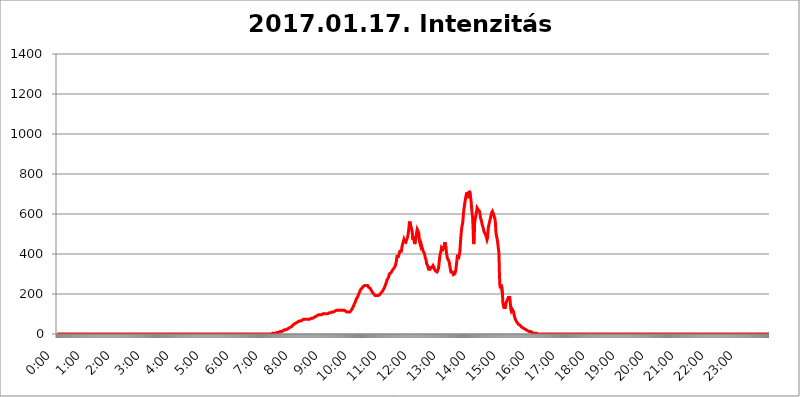
| Category | 2017.01.17. Intenzitás [W/m^2] |
|---|---|
| 0.0 | 0 |
| 0.0006944444444444445 | 0 |
| 0.001388888888888889 | 0 |
| 0.0020833333333333333 | 0 |
| 0.002777777777777778 | 0 |
| 0.003472222222222222 | 0 |
| 0.004166666666666667 | 0 |
| 0.004861111111111111 | 0 |
| 0.005555555555555556 | 0 |
| 0.0062499999999999995 | 0 |
| 0.006944444444444444 | 0 |
| 0.007638888888888889 | 0 |
| 0.008333333333333333 | 0 |
| 0.009027777777777779 | 0 |
| 0.009722222222222222 | 0 |
| 0.010416666666666666 | 0 |
| 0.011111111111111112 | 0 |
| 0.011805555555555555 | 0 |
| 0.012499999999999999 | 0 |
| 0.013194444444444444 | 0 |
| 0.013888888888888888 | 0 |
| 0.014583333333333332 | 0 |
| 0.015277777777777777 | 0 |
| 0.015972222222222224 | 0 |
| 0.016666666666666666 | 0 |
| 0.017361111111111112 | 0 |
| 0.018055555555555557 | 0 |
| 0.01875 | 0 |
| 0.019444444444444445 | 0 |
| 0.02013888888888889 | 0 |
| 0.020833333333333332 | 0 |
| 0.02152777777777778 | 0 |
| 0.022222222222222223 | 0 |
| 0.02291666666666667 | 0 |
| 0.02361111111111111 | 0 |
| 0.024305555555555556 | 0 |
| 0.024999999999999998 | 0 |
| 0.025694444444444447 | 0 |
| 0.02638888888888889 | 0 |
| 0.027083333333333334 | 0 |
| 0.027777777777777776 | 0 |
| 0.02847222222222222 | 0 |
| 0.029166666666666664 | 0 |
| 0.029861111111111113 | 0 |
| 0.030555555555555555 | 0 |
| 0.03125 | 0 |
| 0.03194444444444445 | 0 |
| 0.03263888888888889 | 0 |
| 0.03333333333333333 | 0 |
| 0.034027777777777775 | 0 |
| 0.034722222222222224 | 0 |
| 0.035416666666666666 | 0 |
| 0.036111111111111115 | 0 |
| 0.03680555555555556 | 0 |
| 0.0375 | 0 |
| 0.03819444444444444 | 0 |
| 0.03888888888888889 | 0 |
| 0.03958333333333333 | 0 |
| 0.04027777777777778 | 0 |
| 0.04097222222222222 | 0 |
| 0.041666666666666664 | 0 |
| 0.042361111111111106 | 0 |
| 0.04305555555555556 | 0 |
| 0.043750000000000004 | 0 |
| 0.044444444444444446 | 0 |
| 0.04513888888888889 | 0 |
| 0.04583333333333334 | 0 |
| 0.04652777777777778 | 0 |
| 0.04722222222222222 | 0 |
| 0.04791666666666666 | 0 |
| 0.04861111111111111 | 0 |
| 0.049305555555555554 | 0 |
| 0.049999999999999996 | 0 |
| 0.05069444444444445 | 0 |
| 0.051388888888888894 | 0 |
| 0.052083333333333336 | 0 |
| 0.05277777777777778 | 0 |
| 0.05347222222222222 | 0 |
| 0.05416666666666667 | 0 |
| 0.05486111111111111 | 0 |
| 0.05555555555555555 | 0 |
| 0.05625 | 0 |
| 0.05694444444444444 | 0 |
| 0.057638888888888885 | 0 |
| 0.05833333333333333 | 0 |
| 0.05902777777777778 | 0 |
| 0.059722222222222225 | 0 |
| 0.06041666666666667 | 0 |
| 0.061111111111111116 | 0 |
| 0.06180555555555556 | 0 |
| 0.0625 | 0 |
| 0.06319444444444444 | 0 |
| 0.06388888888888888 | 0 |
| 0.06458333333333334 | 0 |
| 0.06527777777777778 | 0 |
| 0.06597222222222222 | 0 |
| 0.06666666666666667 | 0 |
| 0.06736111111111111 | 0 |
| 0.06805555555555555 | 0 |
| 0.06874999999999999 | 0 |
| 0.06944444444444443 | 0 |
| 0.07013888888888889 | 0 |
| 0.07083333333333333 | 0 |
| 0.07152777777777779 | 0 |
| 0.07222222222222223 | 0 |
| 0.07291666666666667 | 0 |
| 0.07361111111111111 | 0 |
| 0.07430555555555556 | 0 |
| 0.075 | 0 |
| 0.07569444444444444 | 0 |
| 0.0763888888888889 | 0 |
| 0.07708333333333334 | 0 |
| 0.07777777777777778 | 0 |
| 0.07847222222222222 | 0 |
| 0.07916666666666666 | 0 |
| 0.0798611111111111 | 0 |
| 0.08055555555555556 | 0 |
| 0.08125 | 0 |
| 0.08194444444444444 | 0 |
| 0.08263888888888889 | 0 |
| 0.08333333333333333 | 0 |
| 0.08402777777777777 | 0 |
| 0.08472222222222221 | 0 |
| 0.08541666666666665 | 0 |
| 0.08611111111111112 | 0 |
| 0.08680555555555557 | 0 |
| 0.08750000000000001 | 0 |
| 0.08819444444444445 | 0 |
| 0.08888888888888889 | 0 |
| 0.08958333333333333 | 0 |
| 0.09027777777777778 | 0 |
| 0.09097222222222222 | 0 |
| 0.09166666666666667 | 0 |
| 0.09236111111111112 | 0 |
| 0.09305555555555556 | 0 |
| 0.09375 | 0 |
| 0.09444444444444444 | 0 |
| 0.09513888888888888 | 0 |
| 0.09583333333333333 | 0 |
| 0.09652777777777777 | 0 |
| 0.09722222222222222 | 0 |
| 0.09791666666666667 | 0 |
| 0.09861111111111111 | 0 |
| 0.09930555555555555 | 0 |
| 0.09999999999999999 | 0 |
| 0.10069444444444443 | 0 |
| 0.1013888888888889 | 0 |
| 0.10208333333333335 | 0 |
| 0.10277777777777779 | 0 |
| 0.10347222222222223 | 0 |
| 0.10416666666666667 | 0 |
| 0.10486111111111111 | 0 |
| 0.10555555555555556 | 0 |
| 0.10625 | 0 |
| 0.10694444444444444 | 0 |
| 0.1076388888888889 | 0 |
| 0.10833333333333334 | 0 |
| 0.10902777777777778 | 0 |
| 0.10972222222222222 | 0 |
| 0.1111111111111111 | 0 |
| 0.11180555555555556 | 0 |
| 0.11180555555555556 | 0 |
| 0.1125 | 0 |
| 0.11319444444444444 | 0 |
| 0.11388888888888889 | 0 |
| 0.11458333333333333 | 0 |
| 0.11527777777777777 | 0 |
| 0.11597222222222221 | 0 |
| 0.11666666666666665 | 0 |
| 0.1173611111111111 | 0 |
| 0.11805555555555557 | 0 |
| 0.11944444444444445 | 0 |
| 0.12013888888888889 | 0 |
| 0.12083333333333333 | 0 |
| 0.12152777777777778 | 0 |
| 0.12222222222222223 | 0 |
| 0.12291666666666667 | 0 |
| 0.12291666666666667 | 0 |
| 0.12361111111111112 | 0 |
| 0.12430555555555556 | 0 |
| 0.125 | 0 |
| 0.12569444444444444 | 0 |
| 0.12638888888888888 | 0 |
| 0.12708333333333333 | 0 |
| 0.16875 | 0 |
| 0.12847222222222224 | 0 |
| 0.12916666666666668 | 0 |
| 0.12986111111111112 | 0 |
| 0.13055555555555556 | 0 |
| 0.13125 | 0 |
| 0.13194444444444445 | 0 |
| 0.1326388888888889 | 0 |
| 0.13333333333333333 | 0 |
| 0.13402777777777777 | 0 |
| 0.13402777777777777 | 0 |
| 0.13472222222222222 | 0 |
| 0.13541666666666666 | 0 |
| 0.1361111111111111 | 0 |
| 0.13749999999999998 | 0 |
| 0.13819444444444443 | 0 |
| 0.1388888888888889 | 0 |
| 0.13958333333333334 | 0 |
| 0.14027777777777778 | 0 |
| 0.14097222222222222 | 0 |
| 0.14166666666666666 | 0 |
| 0.1423611111111111 | 0 |
| 0.14305555555555557 | 0 |
| 0.14375000000000002 | 0 |
| 0.14444444444444446 | 0 |
| 0.1451388888888889 | 0 |
| 0.1451388888888889 | 0 |
| 0.14652777777777778 | 0 |
| 0.14722222222222223 | 0 |
| 0.14791666666666667 | 0 |
| 0.1486111111111111 | 0 |
| 0.14930555555555555 | 0 |
| 0.15 | 0 |
| 0.15069444444444444 | 0 |
| 0.15138888888888888 | 0 |
| 0.15208333333333332 | 0 |
| 0.15277777777777776 | 0 |
| 0.15347222222222223 | 0 |
| 0.15416666666666667 | 0 |
| 0.15486111111111112 | 0 |
| 0.15555555555555556 | 0 |
| 0.15625 | 0 |
| 0.15694444444444444 | 0 |
| 0.15763888888888888 | 0 |
| 0.15833333333333333 | 0 |
| 0.15902777777777777 | 0 |
| 0.15972222222222224 | 0 |
| 0.16041666666666668 | 0 |
| 0.16111111111111112 | 0 |
| 0.16180555555555556 | 0 |
| 0.1625 | 0 |
| 0.16319444444444445 | 0 |
| 0.1638888888888889 | 0 |
| 0.16458333333333333 | 0 |
| 0.16527777777777777 | 0 |
| 0.16597222222222222 | 0 |
| 0.16666666666666666 | 0 |
| 0.1673611111111111 | 0 |
| 0.16805555555555554 | 0 |
| 0.16874999999999998 | 0 |
| 0.16944444444444443 | 0 |
| 0.17013888888888887 | 0 |
| 0.1708333333333333 | 0 |
| 0.17152777777777775 | 0 |
| 0.17222222222222225 | 0 |
| 0.1729166666666667 | 0 |
| 0.17361111111111113 | 0 |
| 0.17430555555555557 | 0 |
| 0.17500000000000002 | 0 |
| 0.17569444444444446 | 0 |
| 0.1763888888888889 | 0 |
| 0.17708333333333334 | 0 |
| 0.17777777777777778 | 0 |
| 0.17847222222222223 | 0 |
| 0.17916666666666667 | 0 |
| 0.1798611111111111 | 0 |
| 0.18055555555555555 | 0 |
| 0.18125 | 0 |
| 0.18194444444444444 | 0 |
| 0.1826388888888889 | 0 |
| 0.18333333333333335 | 0 |
| 0.1840277777777778 | 0 |
| 0.18472222222222223 | 0 |
| 0.18541666666666667 | 0 |
| 0.18611111111111112 | 0 |
| 0.18680555555555556 | 0 |
| 0.1875 | 0 |
| 0.18819444444444444 | 0 |
| 0.18888888888888888 | 0 |
| 0.18958333333333333 | 0 |
| 0.19027777777777777 | 0 |
| 0.1909722222222222 | 0 |
| 0.19166666666666665 | 0 |
| 0.19236111111111112 | 0 |
| 0.19305555555555554 | 0 |
| 0.19375 | 0 |
| 0.19444444444444445 | 0 |
| 0.1951388888888889 | 0 |
| 0.19583333333333333 | 0 |
| 0.19652777777777777 | 0 |
| 0.19722222222222222 | 0 |
| 0.19791666666666666 | 0 |
| 0.1986111111111111 | 0 |
| 0.19930555555555554 | 0 |
| 0.19999999999999998 | 0 |
| 0.20069444444444443 | 0 |
| 0.20138888888888887 | 0 |
| 0.2020833333333333 | 0 |
| 0.2027777777777778 | 0 |
| 0.2034722222222222 | 0 |
| 0.2041666666666667 | 0 |
| 0.20486111111111113 | 0 |
| 0.20555555555555557 | 0 |
| 0.20625000000000002 | 0 |
| 0.20694444444444446 | 0 |
| 0.2076388888888889 | 0 |
| 0.20833333333333334 | 0 |
| 0.20902777777777778 | 0 |
| 0.20972222222222223 | 0 |
| 0.21041666666666667 | 0 |
| 0.2111111111111111 | 0 |
| 0.21180555555555555 | 0 |
| 0.2125 | 0 |
| 0.21319444444444444 | 0 |
| 0.2138888888888889 | 0 |
| 0.21458333333333335 | 0 |
| 0.2152777777777778 | 0 |
| 0.21597222222222223 | 0 |
| 0.21666666666666667 | 0 |
| 0.21736111111111112 | 0 |
| 0.21805555555555556 | 0 |
| 0.21875 | 0 |
| 0.21944444444444444 | 0 |
| 0.22013888888888888 | 0 |
| 0.22083333333333333 | 0 |
| 0.22152777777777777 | 0 |
| 0.2222222222222222 | 0 |
| 0.22291666666666665 | 0 |
| 0.2236111111111111 | 0 |
| 0.22430555555555556 | 0 |
| 0.225 | 0 |
| 0.22569444444444445 | 0 |
| 0.2263888888888889 | 0 |
| 0.22708333333333333 | 0 |
| 0.22777777777777777 | 0 |
| 0.22847222222222222 | 0 |
| 0.22916666666666666 | 0 |
| 0.2298611111111111 | 0 |
| 0.23055555555555554 | 0 |
| 0.23124999999999998 | 0 |
| 0.23194444444444443 | 0 |
| 0.23263888888888887 | 0 |
| 0.2333333333333333 | 0 |
| 0.2340277777777778 | 0 |
| 0.2347222222222222 | 0 |
| 0.2354166666666667 | 0 |
| 0.23611111111111113 | 0 |
| 0.23680555555555557 | 0 |
| 0.23750000000000002 | 0 |
| 0.23819444444444446 | 0 |
| 0.2388888888888889 | 0 |
| 0.23958333333333334 | 0 |
| 0.24027777777777778 | 0 |
| 0.24097222222222223 | 0 |
| 0.24166666666666667 | 0 |
| 0.2423611111111111 | 0 |
| 0.24305555555555555 | 0 |
| 0.24375 | 0 |
| 0.24444444444444446 | 0 |
| 0.24513888888888888 | 0 |
| 0.24583333333333335 | 0 |
| 0.2465277777777778 | 0 |
| 0.24722222222222223 | 0 |
| 0.24791666666666667 | 0 |
| 0.24861111111111112 | 0 |
| 0.24930555555555556 | 0 |
| 0.25 | 0 |
| 0.25069444444444444 | 0 |
| 0.2513888888888889 | 0 |
| 0.2520833333333333 | 0 |
| 0.25277777777777777 | 0 |
| 0.2534722222222222 | 0 |
| 0.25416666666666665 | 0 |
| 0.2548611111111111 | 0 |
| 0.2555555555555556 | 0 |
| 0.25625000000000003 | 0 |
| 0.2569444444444445 | 0 |
| 0.2576388888888889 | 0 |
| 0.25833333333333336 | 0 |
| 0.2590277777777778 | 0 |
| 0.25972222222222224 | 0 |
| 0.2604166666666667 | 0 |
| 0.2611111111111111 | 0 |
| 0.26180555555555557 | 0 |
| 0.2625 | 0 |
| 0.26319444444444445 | 0 |
| 0.2638888888888889 | 0 |
| 0.26458333333333334 | 0 |
| 0.2652777777777778 | 0 |
| 0.2659722222222222 | 0 |
| 0.26666666666666666 | 0 |
| 0.2673611111111111 | 0 |
| 0.26805555555555555 | 0 |
| 0.26875 | 0 |
| 0.26944444444444443 | 0 |
| 0.2701388888888889 | 0 |
| 0.2708333333333333 | 0 |
| 0.27152777777777776 | 0 |
| 0.2722222222222222 | 0 |
| 0.27291666666666664 | 0 |
| 0.2736111111111111 | 0 |
| 0.2743055555555555 | 0 |
| 0.27499999999999997 | 0 |
| 0.27569444444444446 | 0 |
| 0.27638888888888885 | 0 |
| 0.27708333333333335 | 0 |
| 0.2777777777777778 | 0 |
| 0.27847222222222223 | 0 |
| 0.2791666666666667 | 0 |
| 0.2798611111111111 | 0 |
| 0.28055555555555556 | 0 |
| 0.28125 | 0 |
| 0.28194444444444444 | 0 |
| 0.2826388888888889 | 0 |
| 0.2833333333333333 | 0 |
| 0.28402777777777777 | 0 |
| 0.2847222222222222 | 0 |
| 0.28541666666666665 | 0 |
| 0.28611111111111115 | 0 |
| 0.28680555555555554 | 0 |
| 0.28750000000000003 | 0 |
| 0.2881944444444445 | 0 |
| 0.2888888888888889 | 0 |
| 0.28958333333333336 | 0 |
| 0.2902777777777778 | 0 |
| 0.29097222222222224 | 0 |
| 0.2916666666666667 | 0 |
| 0.2923611111111111 | 0 |
| 0.29305555555555557 | 0 |
| 0.29375 | 0 |
| 0.29444444444444445 | 0 |
| 0.2951388888888889 | 0 |
| 0.29583333333333334 | 0 |
| 0.2965277777777778 | 0 |
| 0.2972222222222222 | 0 |
| 0.29791666666666666 | 0 |
| 0.2986111111111111 | 0 |
| 0.29930555555555555 | 0 |
| 0.3 | 0 |
| 0.30069444444444443 | 3.525 |
| 0.3013888888888889 | 3.525 |
| 0.3020833333333333 | 3.525 |
| 0.30277777777777776 | 3.525 |
| 0.3034722222222222 | 3.525 |
| 0.30416666666666664 | 3.525 |
| 0.3048611111111111 | 3.525 |
| 0.3055555555555555 | 3.525 |
| 0.30624999999999997 | 3.525 |
| 0.3069444444444444 | 3.525 |
| 0.3076388888888889 | 7.887 |
| 0.30833333333333335 | 7.887 |
| 0.3090277777777778 | 7.887 |
| 0.30972222222222223 | 7.887 |
| 0.3104166666666667 | 7.887 |
| 0.3111111111111111 | 12.257 |
| 0.31180555555555556 | 12.257 |
| 0.3125 | 12.257 |
| 0.31319444444444444 | 12.257 |
| 0.3138888888888889 | 12.257 |
| 0.3145833333333333 | 12.257 |
| 0.31527777777777777 | 12.257 |
| 0.3159722222222222 | 12.257 |
| 0.31666666666666665 | 16.636 |
| 0.31736111111111115 | 16.636 |
| 0.31805555555555554 | 16.636 |
| 0.31875000000000003 | 21.024 |
| 0.3194444444444445 | 21.024 |
| 0.3201388888888889 | 21.024 |
| 0.32083333333333336 | 21.024 |
| 0.3215277777777778 | 25.419 |
| 0.32222222222222224 | 25.419 |
| 0.3229166666666667 | 25.419 |
| 0.3236111111111111 | 25.419 |
| 0.32430555555555557 | 29.823 |
| 0.325 | 29.823 |
| 0.32569444444444445 | 29.823 |
| 0.3263888888888889 | 34.234 |
| 0.32708333333333334 | 34.234 |
| 0.3277777777777778 | 34.234 |
| 0.3284722222222222 | 38.653 |
| 0.32916666666666666 | 38.653 |
| 0.3298611111111111 | 38.653 |
| 0.33055555555555555 | 43.079 |
| 0.33125 | 47.511 |
| 0.33194444444444443 | 47.511 |
| 0.3326388888888889 | 47.511 |
| 0.3333333333333333 | 51.951 |
| 0.3340277777777778 | 51.951 |
| 0.3347222222222222 | 56.398 |
| 0.3354166666666667 | 56.398 |
| 0.3361111111111111 | 60.85 |
| 0.3368055555555556 | 60.85 |
| 0.33749999999999997 | 60.85 |
| 0.33819444444444446 | 60.85 |
| 0.33888888888888885 | 60.85 |
| 0.33958333333333335 | 65.31 |
| 0.34027777777777773 | 65.31 |
| 0.34097222222222223 | 65.31 |
| 0.3416666666666666 | 65.31 |
| 0.3423611111111111 | 65.31 |
| 0.3430555555555555 | 69.775 |
| 0.34375 | 69.775 |
| 0.3444444444444445 | 69.775 |
| 0.3451388888888889 | 74.246 |
| 0.3458333333333334 | 74.246 |
| 0.34652777777777777 | 74.246 |
| 0.34722222222222227 | 74.246 |
| 0.34791666666666665 | 74.246 |
| 0.34861111111111115 | 74.246 |
| 0.34930555555555554 | 74.246 |
| 0.35000000000000003 | 74.246 |
| 0.3506944444444444 | 74.246 |
| 0.3513888888888889 | 74.246 |
| 0.3520833333333333 | 74.246 |
| 0.3527777777777778 | 74.246 |
| 0.3534722222222222 | 74.246 |
| 0.3541666666666667 | 74.246 |
| 0.3548611111111111 | 74.246 |
| 0.35555555555555557 | 74.246 |
| 0.35625 | 78.722 |
| 0.35694444444444445 | 78.722 |
| 0.3576388888888889 | 78.722 |
| 0.35833333333333334 | 78.722 |
| 0.3590277777777778 | 83.205 |
| 0.3597222222222222 | 83.205 |
| 0.36041666666666666 | 83.205 |
| 0.3611111111111111 | 83.205 |
| 0.36180555555555555 | 87.692 |
| 0.3625 | 87.692 |
| 0.36319444444444443 | 87.692 |
| 0.3638888888888889 | 92.184 |
| 0.3645833333333333 | 92.184 |
| 0.3652777777777778 | 92.184 |
| 0.3659722222222222 | 92.184 |
| 0.3666666666666667 | 96.682 |
| 0.3673611111111111 | 96.682 |
| 0.3680555555555556 | 96.682 |
| 0.36874999999999997 | 96.682 |
| 0.36944444444444446 | 96.682 |
| 0.37013888888888885 | 96.682 |
| 0.37083333333333335 | 96.682 |
| 0.37152777777777773 | 101.184 |
| 0.37222222222222223 | 101.184 |
| 0.3729166666666666 | 101.184 |
| 0.3736111111111111 | 101.184 |
| 0.3743055555555555 | 101.184 |
| 0.375 | 101.184 |
| 0.3756944444444445 | 101.184 |
| 0.3763888888888889 | 101.184 |
| 0.3770833333333334 | 101.184 |
| 0.37777777777777777 | 101.184 |
| 0.37847222222222227 | 101.184 |
| 0.37916666666666665 | 101.184 |
| 0.37986111111111115 | 105.69 |
| 0.38055555555555554 | 105.69 |
| 0.38125000000000003 | 105.69 |
| 0.3819444444444444 | 105.69 |
| 0.3826388888888889 | 105.69 |
| 0.3833333333333333 | 105.69 |
| 0.3840277777777778 | 105.69 |
| 0.3847222222222222 | 110.201 |
| 0.3854166666666667 | 110.201 |
| 0.3861111111111111 | 110.201 |
| 0.38680555555555557 | 110.201 |
| 0.3875 | 110.201 |
| 0.38819444444444445 | 114.716 |
| 0.3888888888888889 | 114.716 |
| 0.38958333333333334 | 114.716 |
| 0.3902777777777778 | 114.716 |
| 0.3909722222222222 | 119.235 |
| 0.39166666666666666 | 119.235 |
| 0.3923611111111111 | 119.235 |
| 0.39305555555555555 | 119.235 |
| 0.39375 | 119.235 |
| 0.39444444444444443 | 119.235 |
| 0.3951388888888889 | 119.235 |
| 0.3958333333333333 | 119.235 |
| 0.3965277777777778 | 119.235 |
| 0.3972222222222222 | 119.235 |
| 0.3979166666666667 | 119.235 |
| 0.3986111111111111 | 119.235 |
| 0.3993055555555556 | 119.235 |
| 0.39999999999999997 | 119.235 |
| 0.40069444444444446 | 119.235 |
| 0.40138888888888885 | 119.235 |
| 0.40208333333333335 | 119.235 |
| 0.40277777777777773 | 119.235 |
| 0.40347222222222223 | 114.716 |
| 0.4041666666666666 | 114.716 |
| 0.4048611111111111 | 114.716 |
| 0.4055555555555555 | 114.716 |
| 0.40625 | 110.201 |
| 0.4069444444444445 | 110.201 |
| 0.4076388888888889 | 110.201 |
| 0.4083333333333334 | 110.201 |
| 0.40902777777777777 | 110.201 |
| 0.40972222222222227 | 110.201 |
| 0.41041666666666665 | 110.201 |
| 0.41111111111111115 | 114.716 |
| 0.41180555555555554 | 114.716 |
| 0.41250000000000003 | 119.235 |
| 0.4131944444444444 | 123.758 |
| 0.4138888888888889 | 128.284 |
| 0.4145833333333333 | 132.814 |
| 0.4152777777777778 | 137.347 |
| 0.4159722222222222 | 141.884 |
| 0.4166666666666667 | 150.964 |
| 0.4173611111111111 | 155.509 |
| 0.41805555555555557 | 160.056 |
| 0.41875 | 169.156 |
| 0.41944444444444445 | 173.709 |
| 0.4201388888888889 | 178.264 |
| 0.42083333333333334 | 182.82 |
| 0.4215277777777778 | 187.378 |
| 0.4222222222222222 | 191.937 |
| 0.42291666666666666 | 201.058 |
| 0.4236111111111111 | 205.62 |
| 0.42430555555555555 | 210.182 |
| 0.425 | 219.309 |
| 0.42569444444444443 | 219.309 |
| 0.4263888888888889 | 223.873 |
| 0.4270833333333333 | 228.436 |
| 0.4277777777777778 | 233 |
| 0.4284722222222222 | 233 |
| 0.4291666666666667 | 237.564 |
| 0.4298611111111111 | 237.564 |
| 0.4305555555555556 | 242.127 |
| 0.43124999999999997 | 242.127 |
| 0.43194444444444446 | 242.127 |
| 0.43263888888888885 | 242.127 |
| 0.43333333333333335 | 242.127 |
| 0.43402777777777773 | 242.127 |
| 0.43472222222222223 | 242.127 |
| 0.4354166666666666 | 242.127 |
| 0.4361111111111111 | 237.564 |
| 0.4368055555555555 | 233 |
| 0.4375 | 233 |
| 0.4381944444444445 | 228.436 |
| 0.4388888888888889 | 228.436 |
| 0.4395833333333334 | 223.873 |
| 0.44027777777777777 | 219.309 |
| 0.44097222222222227 | 214.746 |
| 0.44166666666666665 | 210.182 |
| 0.44236111111111115 | 210.182 |
| 0.44305555555555554 | 205.62 |
| 0.44375000000000003 | 201.058 |
| 0.4444444444444444 | 196.497 |
| 0.4451388888888889 | 196.497 |
| 0.4458333333333333 | 191.937 |
| 0.4465277777777778 | 191.937 |
| 0.4472222222222222 | 191.937 |
| 0.4479166666666667 | 191.937 |
| 0.4486111111111111 | 191.937 |
| 0.44930555555555557 | 191.937 |
| 0.45 | 191.937 |
| 0.45069444444444445 | 191.937 |
| 0.4513888888888889 | 191.937 |
| 0.45208333333333334 | 196.497 |
| 0.4527777777777778 | 196.497 |
| 0.4534722222222222 | 201.058 |
| 0.45416666666666666 | 205.62 |
| 0.4548611111111111 | 210.182 |
| 0.45555555555555555 | 210.182 |
| 0.45625 | 214.746 |
| 0.45694444444444443 | 219.309 |
| 0.4576388888888889 | 223.873 |
| 0.4583333333333333 | 228.436 |
| 0.4590277777777778 | 233 |
| 0.4597222222222222 | 237.564 |
| 0.4604166666666667 | 246.689 |
| 0.4611111111111111 | 251.251 |
| 0.4618055555555556 | 260.373 |
| 0.46249999999999997 | 269.49 |
| 0.46319444444444446 | 269.49 |
| 0.46388888888888885 | 274.047 |
| 0.46458333333333335 | 283.156 |
| 0.46527777777777773 | 292.259 |
| 0.46597222222222223 | 301.354 |
| 0.4666666666666666 | 305.898 |
| 0.4673611111111111 | 301.354 |
| 0.4680555555555555 | 305.898 |
| 0.46875 | 310.44 |
| 0.4694444444444445 | 310.44 |
| 0.4701388888888889 | 319.517 |
| 0.4708333333333334 | 324.052 |
| 0.47152777777777777 | 324.052 |
| 0.47222222222222227 | 328.584 |
| 0.47291666666666665 | 328.584 |
| 0.47361111111111115 | 328.584 |
| 0.47430555555555554 | 342.162 |
| 0.47500000000000003 | 355.712 |
| 0.4756944444444444 | 364.728 |
| 0.4763888888888889 | 387.202 |
| 0.4770833333333333 | 387.202 |
| 0.4777777777777778 | 387.202 |
| 0.4784722222222222 | 387.202 |
| 0.4791666666666667 | 396.164 |
| 0.4798611111111111 | 400.638 |
| 0.48055555555555557 | 414.035 |
| 0.48125 | 414.035 |
| 0.48194444444444445 | 409.574 |
| 0.4826388888888889 | 414.035 |
| 0.48333333333333334 | 431.833 |
| 0.4840277777777778 | 445.129 |
| 0.4847222222222222 | 449.551 |
| 0.48541666666666666 | 462.786 |
| 0.4861111111111111 | 471.582 |
| 0.48680555555555555 | 462.786 |
| 0.4875 | 467.187 |
| 0.48819444444444443 | 458.38 |
| 0.4888888888888889 | 458.38 |
| 0.4895833333333333 | 467.187 |
| 0.4902777777777778 | 467.187 |
| 0.4909722222222222 | 467.187 |
| 0.4916666666666667 | 489.108 |
| 0.4923611111111111 | 506.542 |
| 0.4930555555555556 | 523.88 |
| 0.49374999999999997 | 553.986 |
| 0.49444444444444446 | 562.53 |
| 0.49513888888888885 | 562.53 |
| 0.49583333333333335 | 541.121 |
| 0.49652777777777773 | 536.82 |
| 0.49722222222222223 | 536.82 |
| 0.4979166666666666 | 510.885 |
| 0.4986111111111111 | 471.582 |
| 0.4993055555555555 | 475.972 |
| 0.5 | 489.108 |
| 0.5006944444444444 | 462.786 |
| 0.5013888888888889 | 449.551 |
| 0.5020833333333333 | 462.786 |
| 0.5027777777777778 | 471.582 |
| 0.5034722222222222 | 475.972 |
| 0.5041666666666667 | 510.885 |
| 0.5048611111111111 | 523.88 |
| 0.5055555555555555 | 519.555 |
| 0.50625 | 523.88 |
| 0.5069444444444444 | 506.542 |
| 0.5076388888888889 | 480.356 |
| 0.5083333333333333 | 458.38 |
| 0.5090277777777777 | 449.551 |
| 0.5097222222222222 | 440.702 |
| 0.5104166666666666 | 449.551 |
| 0.5111111111111112 | 440.702 |
| 0.5118055555555555 | 431.833 |
| 0.5125000000000001 | 422.943 |
| 0.5131944444444444 | 414.035 |
| 0.513888888888889 | 414.035 |
| 0.5145833333333333 | 414.035 |
| 0.5152777777777778 | 400.638 |
| 0.5159722222222222 | 382.715 |
| 0.5166666666666667 | 378.224 |
| 0.517361111111111 | 369.23 |
| 0.5180555555555556 | 351.198 |
| 0.5187499999999999 | 346.682 |
| 0.5194444444444445 | 342.162 |
| 0.5201388888888888 | 333.113 |
| 0.5208333333333334 | 324.052 |
| 0.5215277777777778 | 319.517 |
| 0.5222222222222223 | 319.517 |
| 0.5229166666666667 | 324.052 |
| 0.5236111111111111 | 333.113 |
| 0.5243055555555556 | 337.639 |
| 0.525 | 337.639 |
| 0.5256944444444445 | 333.113 |
| 0.5263888888888889 | 337.639 |
| 0.5270833333333333 | 342.162 |
| 0.5277777777777778 | 342.162 |
| 0.5284722222222222 | 333.113 |
| 0.5291666666666667 | 324.052 |
| 0.5298611111111111 | 324.052 |
| 0.5305555555555556 | 314.98 |
| 0.53125 | 310.44 |
| 0.5319444444444444 | 310.44 |
| 0.5326388888888889 | 310.44 |
| 0.5333333333333333 | 310.44 |
| 0.5340277777777778 | 314.98 |
| 0.5347222222222222 | 328.584 |
| 0.5354166666666667 | 351.198 |
| 0.5361111111111111 | 373.729 |
| 0.5368055555555555 | 396.164 |
| 0.5375 | 405.108 |
| 0.5381944444444444 | 414.035 |
| 0.5388888888888889 | 431.833 |
| 0.5395833333333333 | 431.833 |
| 0.5402777777777777 | 427.39 |
| 0.5409722222222222 | 422.943 |
| 0.5416666666666666 | 422.943 |
| 0.5423611111111112 | 431.833 |
| 0.5430555555555555 | 449.551 |
| 0.5437500000000001 | 458.38 |
| 0.5444444444444444 | 453.968 |
| 0.545138888888889 | 431.833 |
| 0.5458333333333333 | 409.574 |
| 0.5465277777777778 | 391.685 |
| 0.5472222222222222 | 378.224 |
| 0.5479166666666667 | 373.729 |
| 0.548611111111111 | 369.23 |
| 0.5493055555555556 | 364.728 |
| 0.5499999999999999 | 355.712 |
| 0.5506944444444445 | 337.639 |
| 0.5513888888888888 | 324.052 |
| 0.5520833333333334 | 310.44 |
| 0.5527777777777778 | 305.898 |
| 0.5534722222222223 | 305.898 |
| 0.5541666666666667 | 310.44 |
| 0.5548611111111111 | 305.898 |
| 0.5555555555555556 | 296.808 |
| 0.55625 | 296.808 |
| 0.5569444444444445 | 296.808 |
| 0.5576388888888889 | 301.354 |
| 0.5583333333333333 | 305.898 |
| 0.5590277777777778 | 319.517 |
| 0.5597222222222222 | 342.162 |
| 0.5604166666666667 | 364.728 |
| 0.5611111111111111 | 387.202 |
| 0.5618055555555556 | 387.202 |
| 0.5625 | 382.715 |
| 0.5631944444444444 | 382.715 |
| 0.5638888888888889 | 387.202 |
| 0.5645833333333333 | 409.574 |
| 0.5652777777777778 | 445.129 |
| 0.5659722222222222 | 480.356 |
| 0.5666666666666667 | 510.885 |
| 0.5673611111111111 | 532.513 |
| 0.5680555555555555 | 545.416 |
| 0.56875 | 558.261 |
| 0.5694444444444444 | 592.233 |
| 0.5701388888888889 | 617.436 |
| 0.5708333333333333 | 634.105 |
| 0.5715277777777777 | 654.791 |
| 0.5722222222222222 | 667.123 |
| 0.5729166666666666 | 683.473 |
| 0.5736111111111112 | 695.666 |
| 0.5743055555555555 | 707.8 |
| 0.5750000000000001 | 695.666 |
| 0.5756944444444444 | 679.395 |
| 0.576388888888889 | 679.395 |
| 0.5770833333333333 | 695.666 |
| 0.5777777777777778 | 715.858 |
| 0.5784722222222222 | 715.858 |
| 0.5791666666666667 | 703.762 |
| 0.579861111111111 | 679.395 |
| 0.5805555555555556 | 658.909 |
| 0.5812499999999999 | 625.784 |
| 0.5819444444444445 | 600.661 |
| 0.5826388888888888 | 579.542 |
| 0.5833333333333334 | 515.223 |
| 0.5840277777777778 | 449.551 |
| 0.5847222222222223 | 471.582 |
| 0.5854166666666667 | 558.261 |
| 0.5861111111111111 | 575.299 |
| 0.5868055555555556 | 583.779 |
| 0.5875 | 600.661 |
| 0.5881944444444445 | 613.252 |
| 0.5888888888888889 | 629.948 |
| 0.5895833333333333 | 629.948 |
| 0.5902777777777778 | 621.613 |
| 0.5909722222222222 | 617.436 |
| 0.5916666666666667 | 625.784 |
| 0.5923611111111111 | 613.252 |
| 0.5930555555555556 | 596.45 |
| 0.59375 | 579.542 |
| 0.5944444444444444 | 575.299 |
| 0.5951388888888889 | 562.53 |
| 0.5958333333333333 | 549.704 |
| 0.5965277777777778 | 549.704 |
| 0.5972222222222222 | 532.513 |
| 0.5979166666666667 | 523.88 |
| 0.5986111111111111 | 510.885 |
| 0.5993055555555555 | 506.542 |
| 0.6 | 502.192 |
| 0.6006944444444444 | 497.836 |
| 0.6013888888888889 | 489.108 |
| 0.6020833333333333 | 480.356 |
| 0.6027777777777777 | 471.582 |
| 0.6034722222222222 | 480.356 |
| 0.6041666666666666 | 510.885 |
| 0.6048611111111112 | 536.82 |
| 0.6055555555555555 | 549.704 |
| 0.6062500000000001 | 558.261 |
| 0.6069444444444444 | 571.049 |
| 0.607638888888889 | 579.542 |
| 0.6083333333333333 | 592.233 |
| 0.6090277777777778 | 604.864 |
| 0.6097222222222222 | 609.062 |
| 0.6104166666666667 | 613.252 |
| 0.611111111111111 | 609.062 |
| 0.6118055555555556 | 600.661 |
| 0.6124999999999999 | 592.233 |
| 0.6131944444444445 | 583.779 |
| 0.6138888888888888 | 575.299 |
| 0.6145833333333334 | 553.986 |
| 0.6152777777777778 | 506.542 |
| 0.6159722222222223 | 493.475 |
| 0.6166666666666667 | 480.356 |
| 0.6173611111111111 | 467.187 |
| 0.6180555555555556 | 467.187 |
| 0.61875 | 462.786 |
| 0.6194444444444445 | 405.108 |
| 0.6201388888888889 | 301.354 |
| 0.6208333333333333 | 242.127 |
| 0.6215277777777778 | 228.436 |
| 0.6222222222222222 | 228.436 |
| 0.6229166666666667 | 246.689 |
| 0.6236111111111111 | 246.689 |
| 0.6243055555555556 | 205.62 |
| 0.625 | 160.056 |
| 0.6256944444444444 | 141.884 |
| 0.6263888888888889 | 132.814 |
| 0.6270833333333333 | 128.284 |
| 0.6277777777777778 | 128.284 |
| 0.6284722222222222 | 132.814 |
| 0.6291666666666667 | 146.423 |
| 0.6298611111111111 | 160.056 |
| 0.6305555555555555 | 164.605 |
| 0.63125 | 169.156 |
| 0.6319444444444444 | 173.709 |
| 0.6326388888888889 | 182.82 |
| 0.6333333333333333 | 187.378 |
| 0.6340277777777777 | 187.378 |
| 0.6347222222222222 | 182.82 |
| 0.6354166666666666 | 155.509 |
| 0.6361111111111112 | 123.758 |
| 0.6368055555555555 | 114.716 |
| 0.6375000000000001 | 119.235 |
| 0.6381944444444444 | 123.758 |
| 0.638888888888889 | 123.758 |
| 0.6395833333333333 | 114.716 |
| 0.6402777777777778 | 105.69 |
| 0.6409722222222222 | 92.184 |
| 0.6416666666666667 | 83.205 |
| 0.642361111111111 | 74.246 |
| 0.6430555555555556 | 69.775 |
| 0.6437499999999999 | 65.31 |
| 0.6444444444444445 | 60.85 |
| 0.6451388888888888 | 56.398 |
| 0.6458333333333334 | 56.398 |
| 0.6465277777777778 | 51.951 |
| 0.6472222222222223 | 47.511 |
| 0.6479166666666667 | 47.511 |
| 0.6486111111111111 | 43.079 |
| 0.6493055555555556 | 43.079 |
| 0.65 | 38.653 |
| 0.6506944444444445 | 38.653 |
| 0.6513888888888889 | 34.234 |
| 0.6520833333333333 | 34.234 |
| 0.6527777777777778 | 29.823 |
| 0.6534722222222222 | 29.823 |
| 0.6541666666666667 | 29.823 |
| 0.6548611111111111 | 25.419 |
| 0.6555555555555556 | 25.419 |
| 0.65625 | 25.419 |
| 0.6569444444444444 | 21.024 |
| 0.6576388888888889 | 21.024 |
| 0.6583333333333333 | 21.024 |
| 0.6590277777777778 | 21.024 |
| 0.6597222222222222 | 16.636 |
| 0.6604166666666667 | 16.636 |
| 0.6611111111111111 | 16.636 |
| 0.6618055555555555 | 12.257 |
| 0.6625 | 12.257 |
| 0.6631944444444444 | 12.257 |
| 0.6638888888888889 | 12.257 |
| 0.6645833333333333 | 12.257 |
| 0.6652777777777777 | 7.887 |
| 0.6659722222222222 | 7.887 |
| 0.6666666666666666 | 7.887 |
| 0.6673611111111111 | 3.525 |
| 0.6680555555555556 | 3.525 |
| 0.6687500000000001 | 3.525 |
| 0.6694444444444444 | 3.525 |
| 0.6701388888888888 | 3.525 |
| 0.6708333333333334 | 3.525 |
| 0.6715277777777778 | 3.525 |
| 0.6722222222222222 | 3.525 |
| 0.6729166666666666 | 3.525 |
| 0.6736111111111112 | 0 |
| 0.6743055555555556 | 0 |
| 0.6749999999999999 | 0 |
| 0.6756944444444444 | 0 |
| 0.6763888888888889 | 0 |
| 0.6770833333333334 | 0 |
| 0.6777777777777777 | 0 |
| 0.6784722222222223 | 0 |
| 0.6791666666666667 | 0 |
| 0.6798611111111111 | 0 |
| 0.6805555555555555 | 0 |
| 0.68125 | 0 |
| 0.6819444444444445 | 0 |
| 0.6826388888888889 | 0 |
| 0.6833333333333332 | 0 |
| 0.6840277777777778 | 0 |
| 0.6847222222222222 | 0 |
| 0.6854166666666667 | 0 |
| 0.686111111111111 | 0 |
| 0.6868055555555556 | 0 |
| 0.6875 | 0 |
| 0.6881944444444444 | 0 |
| 0.688888888888889 | 0 |
| 0.6895833333333333 | 0 |
| 0.6902777777777778 | 0 |
| 0.6909722222222222 | 0 |
| 0.6916666666666668 | 0 |
| 0.6923611111111111 | 0 |
| 0.6930555555555555 | 0 |
| 0.69375 | 0 |
| 0.6944444444444445 | 0 |
| 0.6951388888888889 | 0 |
| 0.6958333333333333 | 0 |
| 0.6965277777777777 | 0 |
| 0.6972222222222223 | 0 |
| 0.6979166666666666 | 0 |
| 0.6986111111111111 | 0 |
| 0.6993055555555556 | 0 |
| 0.7000000000000001 | 0 |
| 0.7006944444444444 | 0 |
| 0.7013888888888888 | 0 |
| 0.7020833333333334 | 0 |
| 0.7027777777777778 | 0 |
| 0.7034722222222222 | 0 |
| 0.7041666666666666 | 0 |
| 0.7048611111111112 | 0 |
| 0.7055555555555556 | 0 |
| 0.7062499999999999 | 0 |
| 0.7069444444444444 | 0 |
| 0.7076388888888889 | 0 |
| 0.7083333333333334 | 0 |
| 0.7090277777777777 | 0 |
| 0.7097222222222223 | 0 |
| 0.7104166666666667 | 0 |
| 0.7111111111111111 | 0 |
| 0.7118055555555555 | 0 |
| 0.7125 | 0 |
| 0.7131944444444445 | 0 |
| 0.7138888888888889 | 0 |
| 0.7145833333333332 | 0 |
| 0.7152777777777778 | 0 |
| 0.7159722222222222 | 0 |
| 0.7166666666666667 | 0 |
| 0.717361111111111 | 0 |
| 0.7180555555555556 | 0 |
| 0.71875 | 0 |
| 0.7194444444444444 | 0 |
| 0.720138888888889 | 0 |
| 0.7208333333333333 | 0 |
| 0.7215277777777778 | 0 |
| 0.7222222222222222 | 0 |
| 0.7229166666666668 | 0 |
| 0.7236111111111111 | 0 |
| 0.7243055555555555 | 0 |
| 0.725 | 0 |
| 0.7256944444444445 | 0 |
| 0.7263888888888889 | 0 |
| 0.7270833333333333 | 0 |
| 0.7277777777777777 | 0 |
| 0.7284722222222223 | 0 |
| 0.7291666666666666 | 0 |
| 0.7298611111111111 | 0 |
| 0.7305555555555556 | 0 |
| 0.7312500000000001 | 0 |
| 0.7319444444444444 | 0 |
| 0.7326388888888888 | 0 |
| 0.7333333333333334 | 0 |
| 0.7340277777777778 | 0 |
| 0.7347222222222222 | 0 |
| 0.7354166666666666 | 0 |
| 0.7361111111111112 | 0 |
| 0.7368055555555556 | 0 |
| 0.7374999999999999 | 0 |
| 0.7381944444444444 | 0 |
| 0.7388888888888889 | 0 |
| 0.7395833333333334 | 0 |
| 0.7402777777777777 | 0 |
| 0.7409722222222223 | 0 |
| 0.7416666666666667 | 0 |
| 0.7423611111111111 | 0 |
| 0.7430555555555555 | 0 |
| 0.74375 | 0 |
| 0.7444444444444445 | 0 |
| 0.7451388888888889 | 0 |
| 0.7458333333333332 | 0 |
| 0.7465277777777778 | 0 |
| 0.7472222222222222 | 0 |
| 0.7479166666666667 | 0 |
| 0.748611111111111 | 0 |
| 0.7493055555555556 | 0 |
| 0.75 | 0 |
| 0.7506944444444444 | 0 |
| 0.751388888888889 | 0 |
| 0.7520833333333333 | 0 |
| 0.7527777777777778 | 0 |
| 0.7534722222222222 | 0 |
| 0.7541666666666668 | 0 |
| 0.7548611111111111 | 0 |
| 0.7555555555555555 | 0 |
| 0.75625 | 0 |
| 0.7569444444444445 | 0 |
| 0.7576388888888889 | 0 |
| 0.7583333333333333 | 0 |
| 0.7590277777777777 | 0 |
| 0.7597222222222223 | 0 |
| 0.7604166666666666 | 0 |
| 0.7611111111111111 | 0 |
| 0.7618055555555556 | 0 |
| 0.7625000000000001 | 0 |
| 0.7631944444444444 | 0 |
| 0.7638888888888888 | 0 |
| 0.7645833333333334 | 0 |
| 0.7652777777777778 | 0 |
| 0.7659722222222222 | 0 |
| 0.7666666666666666 | 0 |
| 0.7673611111111112 | 0 |
| 0.7680555555555556 | 0 |
| 0.7687499999999999 | 0 |
| 0.7694444444444444 | 0 |
| 0.7701388888888889 | 0 |
| 0.7708333333333334 | 0 |
| 0.7715277777777777 | 0 |
| 0.7722222222222223 | 0 |
| 0.7729166666666667 | 0 |
| 0.7736111111111111 | 0 |
| 0.7743055555555555 | 0 |
| 0.775 | 0 |
| 0.7756944444444445 | 0 |
| 0.7763888888888889 | 0 |
| 0.7770833333333332 | 0 |
| 0.7777777777777778 | 0 |
| 0.7784722222222222 | 0 |
| 0.7791666666666667 | 0 |
| 0.779861111111111 | 0 |
| 0.7805555555555556 | 0 |
| 0.78125 | 0 |
| 0.7819444444444444 | 0 |
| 0.782638888888889 | 0 |
| 0.7833333333333333 | 0 |
| 0.7840277777777778 | 0 |
| 0.7847222222222222 | 0 |
| 0.7854166666666668 | 0 |
| 0.7861111111111111 | 0 |
| 0.7868055555555555 | 0 |
| 0.7875 | 0 |
| 0.7881944444444445 | 0 |
| 0.7888888888888889 | 0 |
| 0.7895833333333333 | 0 |
| 0.7902777777777777 | 0 |
| 0.7909722222222223 | 0 |
| 0.7916666666666666 | 0 |
| 0.7923611111111111 | 0 |
| 0.7930555555555556 | 0 |
| 0.7937500000000001 | 0 |
| 0.7944444444444444 | 0 |
| 0.7951388888888888 | 0 |
| 0.7958333333333334 | 0 |
| 0.7965277777777778 | 0 |
| 0.7972222222222222 | 0 |
| 0.7979166666666666 | 0 |
| 0.7986111111111112 | 0 |
| 0.7993055555555556 | 0 |
| 0.7999999999999999 | 0 |
| 0.8006944444444444 | 0 |
| 0.8013888888888889 | 0 |
| 0.8020833333333334 | 0 |
| 0.8027777777777777 | 0 |
| 0.8034722222222223 | 0 |
| 0.8041666666666667 | 0 |
| 0.8048611111111111 | 0 |
| 0.8055555555555555 | 0 |
| 0.80625 | 0 |
| 0.8069444444444445 | 0 |
| 0.8076388888888889 | 0 |
| 0.8083333333333332 | 0 |
| 0.8090277777777778 | 0 |
| 0.8097222222222222 | 0 |
| 0.8104166666666667 | 0 |
| 0.811111111111111 | 0 |
| 0.8118055555555556 | 0 |
| 0.8125 | 0 |
| 0.8131944444444444 | 0 |
| 0.813888888888889 | 0 |
| 0.8145833333333333 | 0 |
| 0.8152777777777778 | 0 |
| 0.8159722222222222 | 0 |
| 0.8166666666666668 | 0 |
| 0.8173611111111111 | 0 |
| 0.8180555555555555 | 0 |
| 0.81875 | 0 |
| 0.8194444444444445 | 0 |
| 0.8201388888888889 | 0 |
| 0.8208333333333333 | 0 |
| 0.8215277777777777 | 0 |
| 0.8222222222222223 | 0 |
| 0.8229166666666666 | 0 |
| 0.8236111111111111 | 0 |
| 0.8243055555555556 | 0 |
| 0.8250000000000001 | 0 |
| 0.8256944444444444 | 0 |
| 0.8263888888888888 | 0 |
| 0.8270833333333334 | 0 |
| 0.8277777777777778 | 0 |
| 0.8284722222222222 | 0 |
| 0.8291666666666666 | 0 |
| 0.8298611111111112 | 0 |
| 0.8305555555555556 | 0 |
| 0.8312499999999999 | 0 |
| 0.8319444444444444 | 0 |
| 0.8326388888888889 | 0 |
| 0.8333333333333334 | 0 |
| 0.8340277777777777 | 0 |
| 0.8347222222222223 | 0 |
| 0.8354166666666667 | 0 |
| 0.8361111111111111 | 0 |
| 0.8368055555555555 | 0 |
| 0.8375 | 0 |
| 0.8381944444444445 | 0 |
| 0.8388888888888889 | 0 |
| 0.8395833333333332 | 0 |
| 0.8402777777777778 | 0 |
| 0.8409722222222222 | 0 |
| 0.8416666666666667 | 0 |
| 0.842361111111111 | 0 |
| 0.8430555555555556 | 0 |
| 0.84375 | 0 |
| 0.8444444444444444 | 0 |
| 0.845138888888889 | 0 |
| 0.8458333333333333 | 0 |
| 0.8465277777777778 | 0 |
| 0.8472222222222222 | 0 |
| 0.8479166666666668 | 0 |
| 0.8486111111111111 | 0 |
| 0.8493055555555555 | 0 |
| 0.85 | 0 |
| 0.8506944444444445 | 0 |
| 0.8513888888888889 | 0 |
| 0.8520833333333333 | 0 |
| 0.8527777777777777 | 0 |
| 0.8534722222222223 | 0 |
| 0.8541666666666666 | 0 |
| 0.8548611111111111 | 0 |
| 0.8555555555555556 | 0 |
| 0.8562500000000001 | 0 |
| 0.8569444444444444 | 0 |
| 0.8576388888888888 | 0 |
| 0.8583333333333334 | 0 |
| 0.8590277777777778 | 0 |
| 0.8597222222222222 | 0 |
| 0.8604166666666666 | 0 |
| 0.8611111111111112 | 0 |
| 0.8618055555555556 | 0 |
| 0.8624999999999999 | 0 |
| 0.8631944444444444 | 0 |
| 0.8638888888888889 | 0 |
| 0.8645833333333334 | 0 |
| 0.8652777777777777 | 0 |
| 0.8659722222222223 | 0 |
| 0.8666666666666667 | 0 |
| 0.8673611111111111 | 0 |
| 0.8680555555555555 | 0 |
| 0.86875 | 0 |
| 0.8694444444444445 | 0 |
| 0.8701388888888889 | 0 |
| 0.8708333333333332 | 0 |
| 0.8715277777777778 | 0 |
| 0.8722222222222222 | 0 |
| 0.8729166666666667 | 0 |
| 0.873611111111111 | 0 |
| 0.8743055555555556 | 0 |
| 0.875 | 0 |
| 0.8756944444444444 | 0 |
| 0.876388888888889 | 0 |
| 0.8770833333333333 | 0 |
| 0.8777777777777778 | 0 |
| 0.8784722222222222 | 0 |
| 0.8791666666666668 | 0 |
| 0.8798611111111111 | 0 |
| 0.8805555555555555 | 0 |
| 0.88125 | 0 |
| 0.8819444444444445 | 0 |
| 0.8826388888888889 | 0 |
| 0.8833333333333333 | 0 |
| 0.8840277777777777 | 0 |
| 0.8847222222222223 | 0 |
| 0.8854166666666666 | 0 |
| 0.8861111111111111 | 0 |
| 0.8868055555555556 | 0 |
| 0.8875000000000001 | 0 |
| 0.8881944444444444 | 0 |
| 0.8888888888888888 | 0 |
| 0.8895833333333334 | 0 |
| 0.8902777777777778 | 0 |
| 0.8909722222222222 | 0 |
| 0.8916666666666666 | 0 |
| 0.8923611111111112 | 0 |
| 0.8930555555555556 | 0 |
| 0.8937499999999999 | 0 |
| 0.8944444444444444 | 0 |
| 0.8951388888888889 | 0 |
| 0.8958333333333334 | 0 |
| 0.8965277777777777 | 0 |
| 0.8972222222222223 | 0 |
| 0.8979166666666667 | 0 |
| 0.8986111111111111 | 0 |
| 0.8993055555555555 | 0 |
| 0.9 | 0 |
| 0.9006944444444445 | 0 |
| 0.9013888888888889 | 0 |
| 0.9020833333333332 | 0 |
| 0.9027777777777778 | 0 |
| 0.9034722222222222 | 0 |
| 0.9041666666666667 | 0 |
| 0.904861111111111 | 0 |
| 0.9055555555555556 | 0 |
| 0.90625 | 0 |
| 0.9069444444444444 | 0 |
| 0.907638888888889 | 0 |
| 0.9083333333333333 | 0 |
| 0.9090277777777778 | 0 |
| 0.9097222222222222 | 0 |
| 0.9104166666666668 | 0 |
| 0.9111111111111111 | 0 |
| 0.9118055555555555 | 0 |
| 0.9125 | 0 |
| 0.9131944444444445 | 0 |
| 0.9138888888888889 | 0 |
| 0.9145833333333333 | 0 |
| 0.9152777777777777 | 0 |
| 0.9159722222222223 | 0 |
| 0.9166666666666666 | 0 |
| 0.9173611111111111 | 0 |
| 0.9180555555555556 | 0 |
| 0.9187500000000001 | 0 |
| 0.9194444444444444 | 0 |
| 0.9201388888888888 | 0 |
| 0.9208333333333334 | 0 |
| 0.9215277777777778 | 0 |
| 0.9222222222222222 | 0 |
| 0.9229166666666666 | 0 |
| 0.9236111111111112 | 0 |
| 0.9243055555555556 | 0 |
| 0.9249999999999999 | 0 |
| 0.9256944444444444 | 0 |
| 0.9263888888888889 | 0 |
| 0.9270833333333334 | 0 |
| 0.9277777777777777 | 0 |
| 0.9284722222222223 | 0 |
| 0.9291666666666667 | 0 |
| 0.9298611111111111 | 0 |
| 0.9305555555555555 | 0 |
| 0.93125 | 0 |
| 0.9319444444444445 | 0 |
| 0.9326388888888889 | 0 |
| 0.9333333333333332 | 0 |
| 0.9340277777777778 | 0 |
| 0.9347222222222222 | 0 |
| 0.9354166666666667 | 0 |
| 0.936111111111111 | 0 |
| 0.9368055555555556 | 0 |
| 0.9375 | 0 |
| 0.9381944444444444 | 0 |
| 0.938888888888889 | 0 |
| 0.9395833333333333 | 0 |
| 0.9402777777777778 | 0 |
| 0.9409722222222222 | 0 |
| 0.9416666666666668 | 0 |
| 0.9423611111111111 | 0 |
| 0.9430555555555555 | 0 |
| 0.94375 | 0 |
| 0.9444444444444445 | 0 |
| 0.9451388888888889 | 0 |
| 0.9458333333333333 | 0 |
| 0.9465277777777777 | 0 |
| 0.9472222222222223 | 0 |
| 0.9479166666666666 | 0 |
| 0.9486111111111111 | 0 |
| 0.9493055555555556 | 0 |
| 0.9500000000000001 | 0 |
| 0.9506944444444444 | 0 |
| 0.9513888888888888 | 0 |
| 0.9520833333333334 | 0 |
| 0.9527777777777778 | 0 |
| 0.9534722222222222 | 0 |
| 0.9541666666666666 | 0 |
| 0.9548611111111112 | 0 |
| 0.9555555555555556 | 0 |
| 0.9562499999999999 | 0 |
| 0.9569444444444444 | 0 |
| 0.9576388888888889 | 0 |
| 0.9583333333333334 | 0 |
| 0.9590277777777777 | 0 |
| 0.9597222222222223 | 0 |
| 0.9604166666666667 | 0 |
| 0.9611111111111111 | 0 |
| 0.9618055555555555 | 0 |
| 0.9625 | 0 |
| 0.9631944444444445 | 0 |
| 0.9638888888888889 | 0 |
| 0.9645833333333332 | 0 |
| 0.9652777777777778 | 0 |
| 0.9659722222222222 | 0 |
| 0.9666666666666667 | 0 |
| 0.967361111111111 | 0 |
| 0.9680555555555556 | 0 |
| 0.96875 | 0 |
| 0.9694444444444444 | 0 |
| 0.970138888888889 | 0 |
| 0.9708333333333333 | 0 |
| 0.9715277777777778 | 0 |
| 0.9722222222222222 | 0 |
| 0.9729166666666668 | 0 |
| 0.9736111111111111 | 0 |
| 0.9743055555555555 | 0 |
| 0.975 | 0 |
| 0.9756944444444445 | 0 |
| 0.9763888888888889 | 0 |
| 0.9770833333333333 | 0 |
| 0.9777777777777777 | 0 |
| 0.9784722222222223 | 0 |
| 0.9791666666666666 | 0 |
| 0.9798611111111111 | 0 |
| 0.9805555555555556 | 0 |
| 0.9812500000000001 | 0 |
| 0.9819444444444444 | 0 |
| 0.9826388888888888 | 0 |
| 0.9833333333333334 | 0 |
| 0.9840277777777778 | 0 |
| 0.9847222222222222 | 0 |
| 0.9854166666666666 | 0 |
| 0.9861111111111112 | 0 |
| 0.9868055555555556 | 0 |
| 0.9874999999999999 | 0 |
| 0.9881944444444444 | 0 |
| 0.9888888888888889 | 0 |
| 0.9895833333333334 | 0 |
| 0.9902777777777777 | 0 |
| 0.9909722222222223 | 0 |
| 0.9916666666666667 | 0 |
| 0.9923611111111111 | 0 |
| 0.9930555555555555 | 0 |
| 0.99375 | 0 |
| 0.9944444444444445 | 0 |
| 0.9951388888888889 | 0 |
| 0.9958333333333332 | 0 |
| 0.9965277777777778 | 0 |
| 0.9972222222222222 | 0 |
| 0.9979166666666667 | 0 |
| 0.998611111111111 | 0 |
| 0.9993055555555556 | 0 |